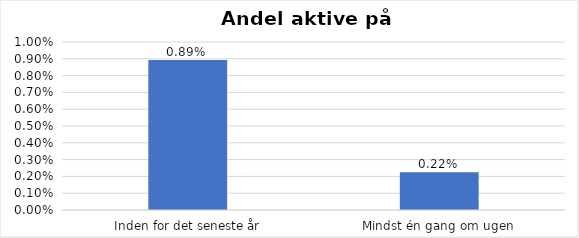
| Category | % |
|---|---|
| Inden for det seneste år | 0.009 |
| Mindst én gang om ugen | 0.002 |